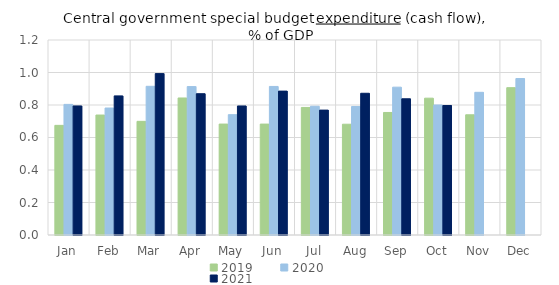
| Category | 2019 | 2020 | 2021 |
|---|---|---|---|
| Jan | 0.675 | 0.804 | 0.794 |
| Feb | 0.738 | 0.781 | 0.856 |
| Mar | 0.699 | 0.915 | 0.993 |
| Apr | 0.843 | 0.913 | 0.869 |
| May | 0.683 | 0.741 | 0.794 |
| Jun | 0.683 | 0.914 | 0.885 |
| Jul | 0.785 | 0.792 | 0.769 |
| Aug | 0.682 | 0.791 | 0.872 |
| Sep | 0.754 | 0.91 | 0.838 |
| Oct | 0.842 | 0.8 | 0.797 |
| Nov | 0.74 | 0.878 | 0 |
| Dec | 0.907 | 0.963 | 0 |